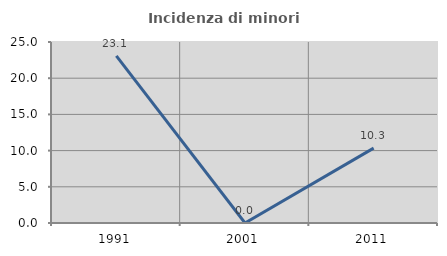
| Category | Incidenza di minori stranieri |
|---|---|
| 1991.0 | 23.077 |
| 2001.0 | 0 |
| 2011.0 | 10.345 |